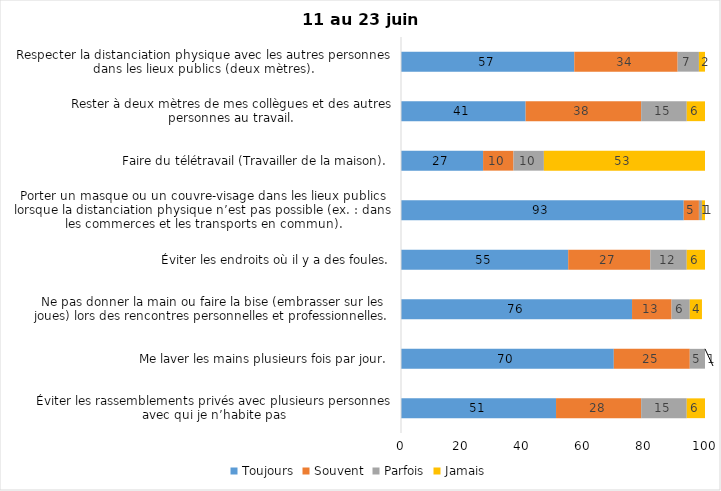
| Category | Toujours | Souvent | Parfois | Jamais |
|---|---|---|---|---|
| Éviter les rassemblements privés avec plusieurs personnes avec qui je n’habite pas | 51 | 28 | 15 | 6 |
| Me laver les mains plusieurs fois par jour. | 70 | 25 | 5 | 1 |
| Ne pas donner la main ou faire la bise (embrasser sur les joues) lors des rencontres personnelles et professionnelles. | 76 | 13 | 6 | 4 |
| Éviter les endroits où il y a des foules. | 55 | 27 | 12 | 6 |
| Porter un masque ou un couvre-visage dans les lieux publics lorsque la distanciation physique n’est pas possible (ex. : dans les commerces et les transports en commun). | 93 | 5 | 1 | 1 |
| Faire du télétravail (Travailler de la maison). | 27 | 10 | 10 | 53 |
| Rester à deux mètres de mes collègues et des autres personnes au travail. | 41 | 38 | 15 | 6 |
| Respecter la distanciation physique avec les autres personnes dans les lieux publics (deux mètres). | 57 | 34 | 7 | 2 |